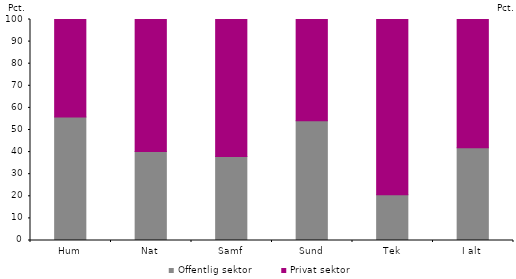
| Category | Offentlig sektor | Privat sektor |
|---|---|---|
| Hum | 55.9 | 44.1 |
| Nat | 40.3 | 59.7 |
| Samf | 38 | 62 |
| Sund | 54.2 | 45.8 |
| Tek | 20.7 | 79.3 |
| I alt | 42 | 58 |